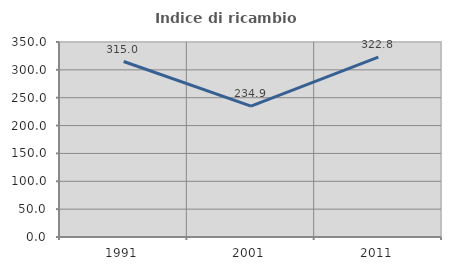
| Category | Indice di ricambio occupazionale  |
|---|---|
| 1991.0 | 315 |
| 2001.0 | 234.868 |
| 2011.0 | 322.835 |